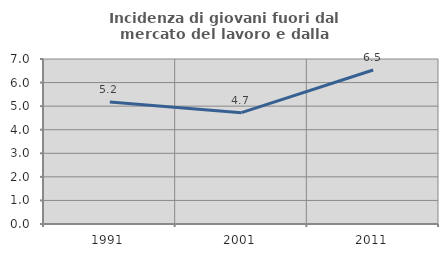
| Category | Incidenza di giovani fuori dal mercato del lavoro e dalla formazione  |
|---|---|
| 1991.0 | 5.176 |
| 2001.0 | 4.723 |
| 2011.0 | 6.535 |